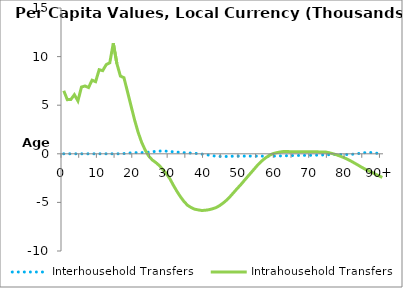
| Category | Interhousehold Transfers | Intrahousehold Transfers |
|---|---|---|
| 0 | 0 | 6484.38 |
|  | 0 | 5568.683 |
| 2 | 0 | 5591.981 |
| 3 | 0 | 6080.086 |
| 4 | 0 | 5439.827 |
| 5 | 0 | 6866.909 |
| 6 | 0 | 6976.732 |
| 7 | 0 | 6819.09 |
| 8 | 0 | 7571.781 |
| 9 | 0 | 7421.486 |
| 10 | 0 | 8649.994 |
| 11 | 0 | 8554.165 |
| 12 | 0 | 9173.822 |
| 13 | 0 | 9363.508 |
| 14 | 0 | 11377.301 |
| 15 | 0 | 9294.209 |
| 16 | 2.201 | 7998.083 |
| 17 | 22.776 | 7830.883 |
| 18 | 57.778 | 6405.957 |
| 19 | 94.373 | 4946.766 |
| 20 | 118.147 | 3500.75 |
| 21 | 122.08 | 2229.865 |
| 22 | 125.18 | 1186.509 |
| 23 | 128.703 | 391.909 |
| 24 | 168.718 | -228.494 |
| 25 | 209.258 | -627.838 |
| 26 | 251.031 | -892.65 |
| 27 | 279.098 | -1206.316 |
| 28 | 295.975 | -1620.326 |
| 29 | 271.459 | -2043.867 |
| 30 | 241.4 | -2575.774 |
| 31 | 204.392 | -3253.682 |
| 32 | 170.606 | -3873.66 |
| 33 | 144.149 | -4435.948 |
| 34 | 120.363 | -4917.288 |
| 35 | 95.938 | -5301.213 |
| 36 | 70.633 | -5528.375 |
| 37 | 50.307 | -5700.545 |
| 38 | 16.986 | -5771.402 |
| 39 | -26.78 | -5832.123 |
| 40 | -78.86 | -5807.704 |
| 41 | -130.443 | -5752.696 |
| 42 | -195.535 | -5662.778 |
| 43 | -239.076 | -5544.327 |
| 44 | -267.99 | -5339.364 |
| 45 | -273.177 | -5078.23 |
| 46 | -275.137 | -4774.065 |
| 47 | -255.984 | -4405.03 |
| 48 | -245.128 | -3992.413 |
| 49 | -237.599 | -3579.759 |
| 50 | -237.909 | -3186.401 |
| 51 | -235.183 | -2756.814 |
| 52 | -237.571 | -2330.836 |
| 53 | -239.229 | -1913.905 |
| 54 | -239.795 | -1493.447 |
| 55 | -240.108 | -1074.245 |
| 56 | -240.038 | -722.766 |
| 57 | -240.518 | -428.782 |
| 58 | -241.656 | -175.91 |
| 59 | -236.752 | 1.11 |
| 60 | -232.042 | 100.559 |
| 61 | -223.302 | 178.33 |
| 62 | -212.363 | 231.694 |
| 63 | -197.948 | 234.823 |
| 64 | -187.077 | 218.548 |
| 65 | -176.031 | 220.8 |
| 66 | -168.797 | 221.684 |
| 67 | -166.73 | 210.18 |
| 68 | -163.876 | 208 |
| 69 | -159.717 | 205.651 |
| 70 | -156.143 | 221.341 |
| 71 | -147.668 | 204.508 |
| 72 | -135.63 | 197.773 |
| 73 | -120.996 | 193.93 |
| 74 | -106.238 | 186.082 |
| 75 | -89.085 | 109.807 |
| 76 | -80.153 | 12.133 |
| 77 | -71.975 | -95.378 |
| 78 | -70.531 | -226.885 |
| 79 | -69.312 | -372.161 |
| 80 | -73.042 | -529.737 |
| 81 | -53.309 | -716.265 |
| 82 | -32.469 | -919.405 |
| 83 | 15.504 | -1127.602 |
| 84 | 63.299 | -1346.113 |
| 85 | 114.048 | -1546.232 |
| 86 | 126.954 | -1717.828 |
| 87 | 124.599 | -1896.689 |
| 88 | 83.401 | -2077.341 |
| 89 | 26.206 | -2255.509 |
| 90+ | -30.988 | -2433.677 |